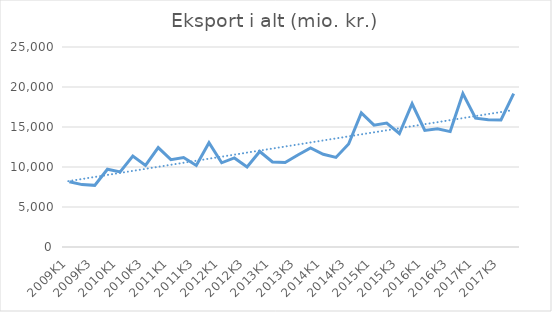
| Category | Eksport i alt (mio. kr.) |
|---|---|
| 2009K1 | 8163.118 |
| 2009K2 | 7797.821 |
| 2009K3 | 7703.939 |
| 2009K4 | 9720.063 |
| 2010K1 | 9387.967 |
| 2010K2 | 11379.182 |
| 2010K3 | 10198.692 |
| 2010K4 | 12419.094 |
| 2011K1 | 10915.805 |
| 2011K2 | 11176.737 |
| 2011K3 | 10193.964 |
| 2011K4 | 13032.828 |
| 2012K1 | 10527.21 |
| 2012K2 | 11132.282 |
| 2012K3 | 9993.478 |
| 2012K4 | 11938.306 |
| 2013K1 | 10622.393 |
| 2013K2 | 10550.756 |
| 2013K3 | 11504.857 |
| 2013K4 | 12393.65 |
| 2014K1 | 11596.962 |
| 2014K2 | 11198.03 |
| 2014K3 | 12870.469 |
| 2014K4 | 16753.509 |
| 2015K1 | 15226.538 |
| 2015K2 | 15492.725 |
| 2015K3 | 14190.684 |
| 2015K4 | 17904.261 |
| 2016K1 | 14567.192 |
| 2016K2 | 14775.638 |
| 2016K3 | 14425.553 |
| 2016K4 | 19188.262 |
| 2017K1 | 16097.879 |
| 2017K2 | 15908.907 |
| 2017K3 | 15879.26 |
| 2017K4 | 19165.65 |